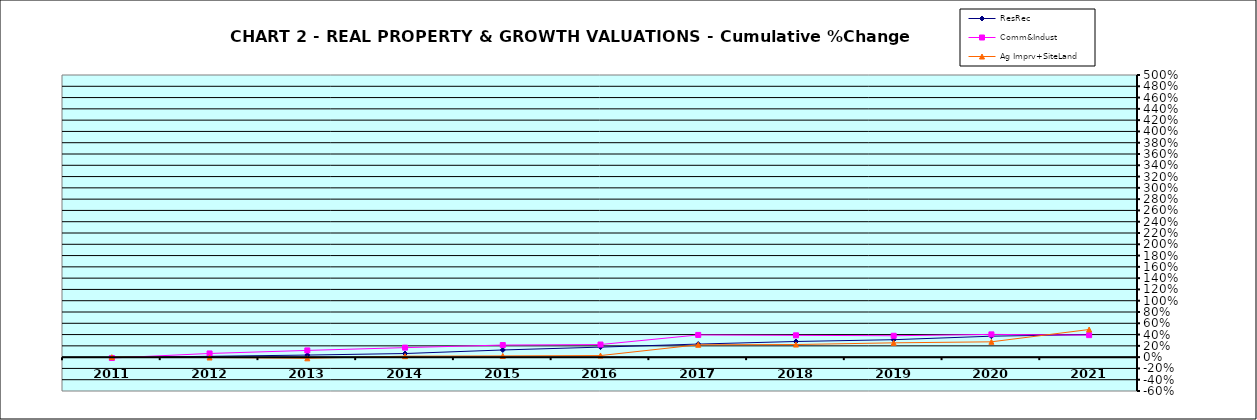
| Category | ResRec | Comm&Indust | Ag Imprv+SiteLand |
|---|---|---|---|
| 2011.0 | -0.008 | -0.015 | 0 |
| 2012.0 | 0.015 | 0.065 | -0.006 |
| 2013.0 | 0.037 | 0.119 | -0.021 |
| 2014.0 | 0.064 | 0.169 | 0.017 |
| 2015.0 | 0.127 | 0.215 | 0.022 |
| 2016.0 | 0.178 | 0.223 | 0.028 |
| 2017.0 | 0.232 | 0.394 | 0.219 |
| 2018.0 | 0.277 | 0.387 | 0.223 |
| 2019.0 | 0.309 | 0.379 | 0.254 |
| 2020.0 | 0.371 | 0.403 | 0.272 |
| 2021.0 | 0.399 | 0.39 | 0.49 |